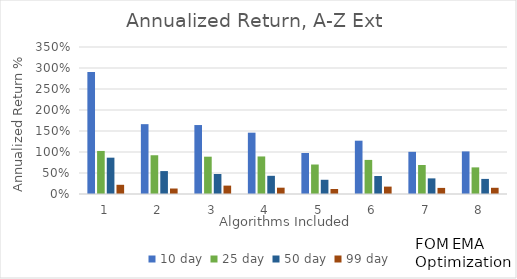
| Category | 10 day | 25 day | 50 day | 99 day |
|---|---|---|---|---|
| 1.0 | 2.907 | 1.025 | 0.865 | 0.219 |
| 2.0 | 1.663 | 0.923 | 0.546 | 0.131 |
| 3.0 | 1.642 | 0.888 | 0.476 | 0.2 |
| 4.0 | 1.46 | 0.894 | 0.433 | 0.15 |
| 5.0 | 0.976 | 0.702 | 0.339 | 0.119 |
| 6.0 | 1.269 | 0.812 | 0.428 | 0.176 |
| 7.0 | 1.004 | 0.691 | 0.372 | 0.145 |
| 8.0 | 1.014 | 0.634 | 0.359 | 0.148 |